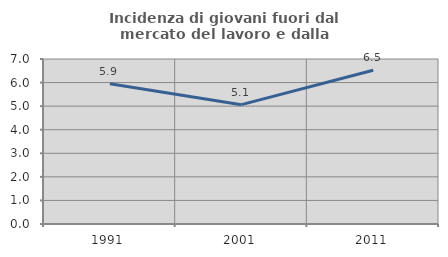
| Category | Incidenza di giovani fuori dal mercato del lavoro e dalla formazione  |
|---|---|
| 1991.0 | 5.95 |
| 2001.0 | 5.063 |
| 2011.0 | 6.524 |